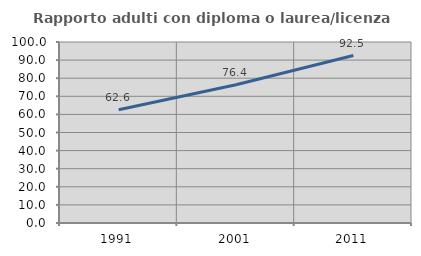
| Category | Rapporto adulti con diploma o laurea/licenza media  |
|---|---|
| 1991.0 | 62.598 |
| 2001.0 | 76.419 |
| 2011.0 | 92.503 |